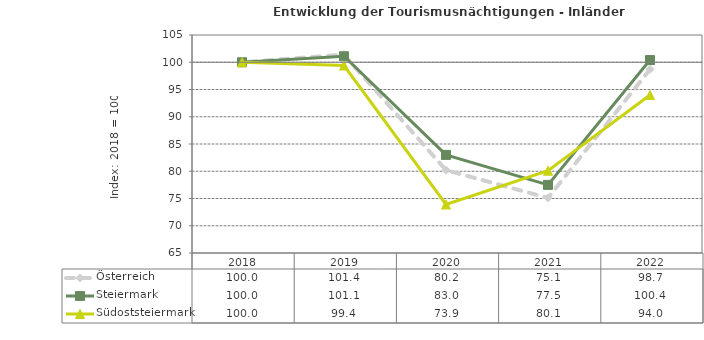
| Category | Österreich | Steiermark | Südoststeiermark |
|---|---|---|---|
| 2022.0 | 98.7 | 100.4 | 94 |
| 2021.0 | 75.1 | 77.5 | 80.1 |
| 2020.0 | 80.2 | 83 | 73.9 |
| 2019.0 | 101.4 | 101.1 | 99.4 |
| 2018.0 | 100 | 100 | 100 |